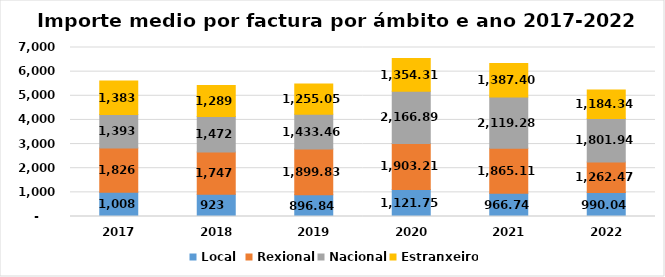
| Category | Local  | Rexional | Nacional | Estranxeiro |
|---|---|---|---|---|
| 2017.0 | 1008.147 | 1825.799 | 1392.907 | 1383.137 |
| 2018.0 | 922.872 | 1746.574 | 1472.454 | 1288.617 |
| 2019.0 | 896.839 | 1899.826 | 1433.465 | 1255.048 |
| 2020.0 | 1121.752 | 1903.213 | 2166.887 | 1354.307 |
| 2021.0 | 966.74 | 1865.11 | 2119.28 | 1387.4 |
| 2022.0 | 990.041 | 1262.469 | 1801.943 | 1184.344 |